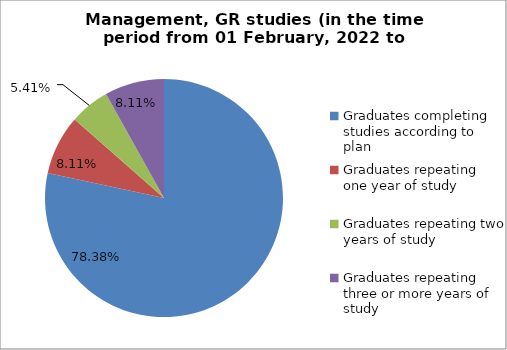
| Category | Series 0 |
|---|---|
| Graduates completing studies according to plan | 78.378 |
| Graduates repeating one year of study | 8.108 |
| Graduates repeating two years of study | 5.405 |
| Graduates repeating three or more years of study | 8.108 |